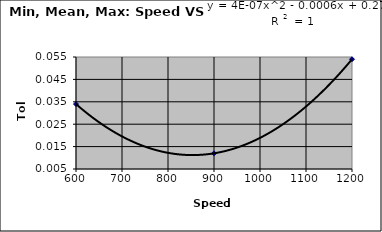
| Category | TOL, mm |
|---|---|
| 600.0 | 0.034 |
| 900.0 | 0.012 |
| 1200.0 | 0.054 |